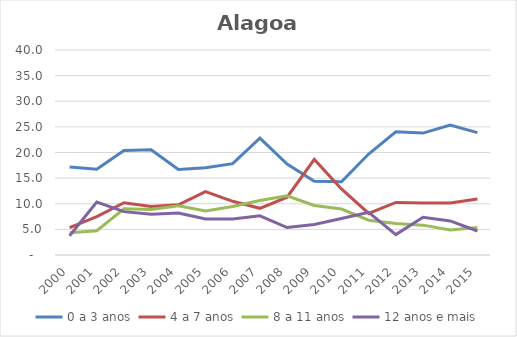
| Category | 0 a 3 anos | 4 a 7 anos | 8 a 11 anos | 12 anos e mais |
|---|---|---|---|---|
| 2000.0 | 17.163 | 5.32 | 4.339 | 3.763 |
| 2001.0 | 16.73 | 7.48 | 4.745 | 10.337 |
| 2002.0 | 20.372 | 10.208 | 9.032 | 8.46 |
| 2003.0 | 20.547 | 9.478 | 8.897 | 7.946 |
| 2004.0 | 16.681 | 9.804 | 9.616 | 8.197 |
| 2005.0 | 17.022 | 12.366 | 8.595 | 7.044 |
| 2006.0 | 17.831 | 10.474 | 9.472 | 7.018 |
| 2007.0 | 22.808 | 9.11 | 10.617 | 7.656 |
| 2008.0 | 17.746 | 11.282 | 11.54 | 5.35 |
| 2009.0 | 14.385 | 18.66 | 9.663 | 5.941 |
| 2010.0 | 14.292 | 12.896 | 8.976 | 7.127 |
| 2011.0 | 19.709 | 8.114 | 6.795 | 8.322 |
| 2012.0 | 24.038 | 10.253 | 6.14 | 3.984 |
| 2013.0 | 23.789 | 10.137 | 5.828 | 7.377 |
| 2014.0 | 25.362 | 10.128 | 4.868 | 6.652 |
| 2015.0 | 23.887 | 10.906 | 5.383 | 4.682 |